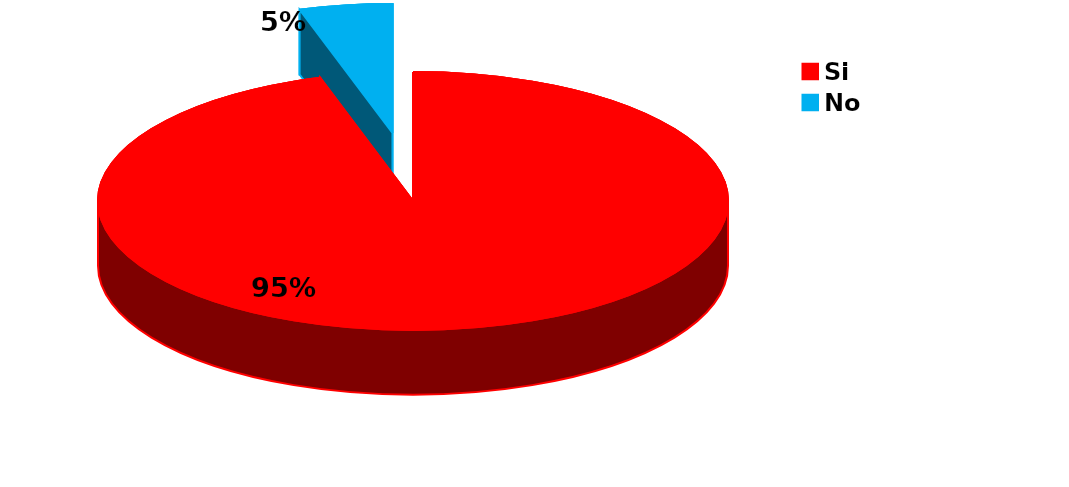
| Category | Series 0 |
|---|---|
| Si | 140 |
| No | 7 |